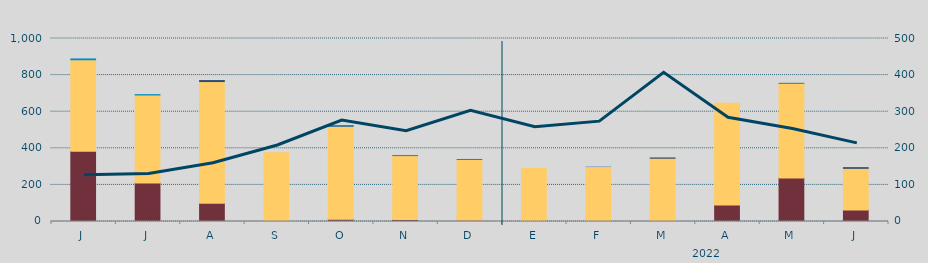
| Category | Carbón | Ciclo Combinado | Cogeneración | Consumo Bombeo | Eólica | Hidráulica | Otras Renovables | Solar fotovoltaica | Solar térmica | Turbinación bombeo | Nuclear |
|---|---|---|---|---|---|---|---|---|---|---|---|
| J | 383637 | 499983.7 | 0 | 0 | 0 | 4778.5 | 0 | 0 | 0 | 0 | 0 |
| J | 210445 | 480749.8 | 0 | 0 | 0 | 1914.7 | 0 | 0 | 0 | 0 | 0 |
| A | 99208.5 | 665537.8 | 0 | 5384.9 | 0 | 0 | 0 | 0 | 0 | 0 | 0 |
| S | 634 | 375205.9 | 0 | 0 | 0 | 0 | 0 | 0 | 0 | 0 | 0 |
| O | 12750 | 508119.2 | 0 | 1625.9 | 0 | 597.8 | 0 | 0 | 0 | 0 | 0 |
| N | 11251 | 348916.7 | 0 | 0 | 0 | 100 | 0 | 0 | 0 | 0 | 0 |
| D | 6493 | 332239.3 | 0 | 0 | 0 | 335 | 0 | 0 | 0 | 0 | 0 |
| E | 4320 | 285393.5 | 0 | 0 | 0 | 0 | 0 | 0 | 0 | 0 | 0 |
| F | 5118.6 | 294678.7 | 0 | 0 | 0 | 0 | 0 | 0 | 0 | 84.5 | 0 |
| M | 280 | 345584.7 | 0 | 1304.2 | 0 | 0 | 0 | 0 | 0 | 0 | 0 |
| A | 89745.4 | 556069.1 | 0 | 0 | 0 | 0 | 0 | 0 | 0 | 0 | 0 |
| M | 238246.1 | 516625.8 | 0 | 0 | 0 | 170 | 0 | 0 | 0 | 0 | 0 |
| J | 63431.6 | 227120.9 | 0 | 3696.9 | 0 | 0 | 0 | 0 | 0 | 0 | 0 |